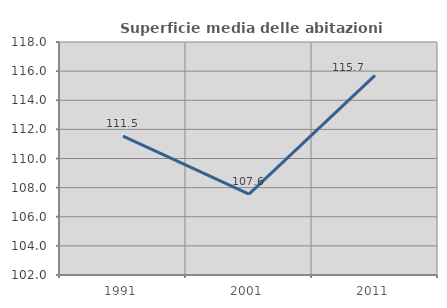
| Category | Superficie media delle abitazioni occupate |
|---|---|
| 1991.0 | 111.532 |
| 2001.0 | 107.56 |
| 2011.0 | 115.71 |